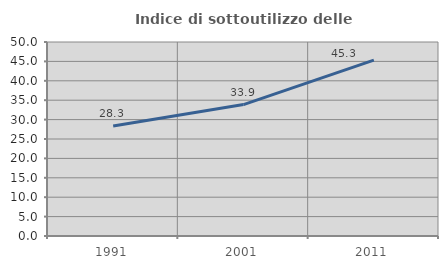
| Category | Indice di sottoutilizzo delle abitazioni  |
|---|---|
| 1991.0 | 28.333 |
| 2001.0 | 33.871 |
| 2011.0 | 45.324 |